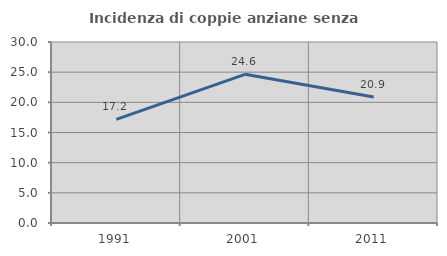
| Category | Incidenza di coppie anziane senza figli  |
|---|---|
| 1991.0 | 17.177 |
| 2001.0 | 24.645 |
| 2011.0 | 20.892 |